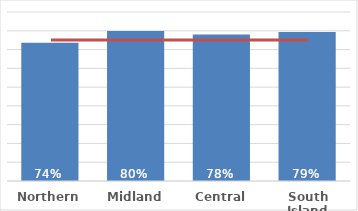
| Category | Pacific |
|---|---|
| Northern | 0.736 |
| Midland | 0.799 |
| Central | 0.78 |
| South Island | 0.794 |